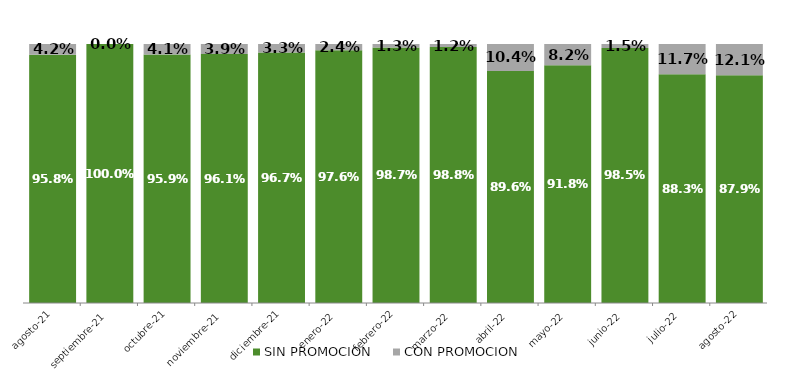
| Category | SIN PROMOCION   | CON PROMOCION   |
|---|---|---|
| 2021-08-01 | 0.958 | 0.042 |
| 2021-09-01 | 1 | 0 |
| 2021-10-01 | 0.959 | 0.041 |
| 2021-11-01 | 0.961 | 0.039 |
| 2021-12-01 | 0.967 | 0.033 |
| 2022-01-01 | 0.976 | 0.024 |
| 2022-02-01 | 0.987 | 0.013 |
| 2022-03-01 | 0.988 | 0.012 |
| 2022-04-01 | 0.896 | 0.104 |
| 2022-05-01 | 0.918 | 0.082 |
| 2022-06-01 | 0.985 | 0.015 |
| 2022-07-01 | 0.883 | 0.117 |
| 2022-08-01 | 0.879 | 0.121 |